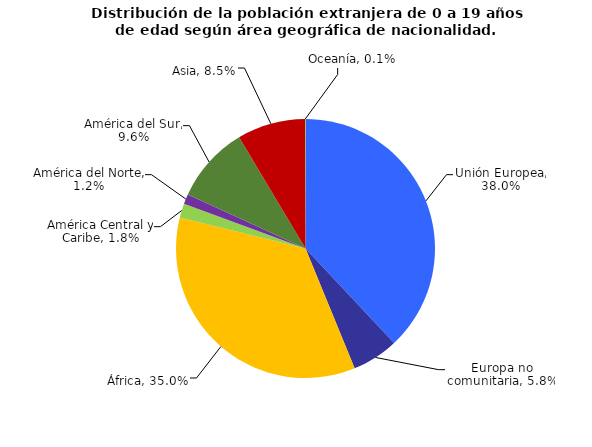
| Category | Series 0 |
|---|---|
| Unión Europea | 0.38 |
| Europa no comunitaria | 0.058 |
| África | 0.35 |
| América Central y Caribe | 0.018 |
| América del Norte | 0.012 |
| América del Sur | 0.096 |
| Asia | 0.085 |
| Oceanía | 0.001 |